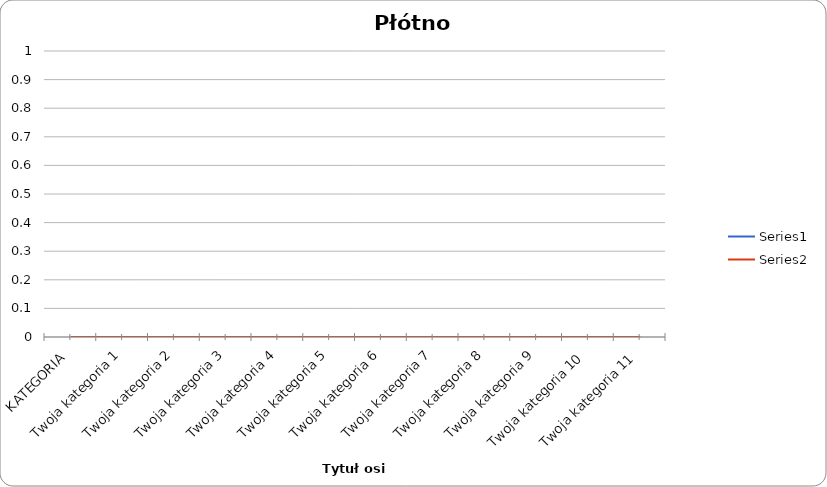
| Category | Series 0 | Series 1 |
|---|---|---|
| KATEGORIA | 0 | 0 |
| Twoja kategoria 1 | 0 | 0 |
| Twoja kategoria 2 | 0 | 0 |
| Twoja kategoria 3 | 0 | 0 |
| Twoja kategoria 4 | 0 | 0 |
| Twoja kategoria 5 | 0 | 0 |
| Twoja kategoria 6 | 0 | 0 |
| Twoja kategoria 7 | 0 | 0 |
| Twoja kategoria 8 | 0 | 0 |
| Twoja kategoria 9 | 0 | 0 |
| Twoja kategoria 10 | 0 | 0 |
| Twoja kategoria 11 | 0 | 0 |